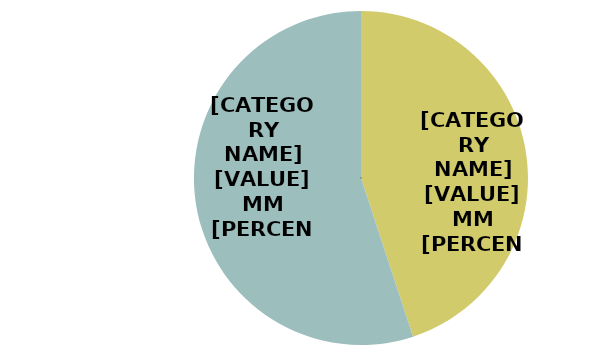
| Category | Series 0 |
|---|---|
| SLICED | 53.991 |
| WHOLE | 66.122 |